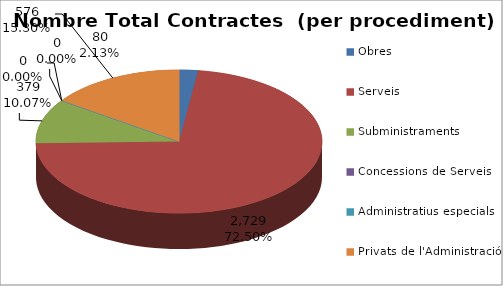
| Category | Nombre Total Contractes |
|---|---|
| Obres | 80 |
| Serveis | 2729 |
| Subministraments | 379 |
| Concessions de Serveis | 0 |
| Administratius especials | 0 |
| Privats de l'Administració | 576 |